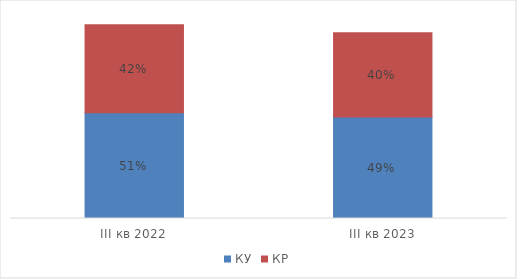
| Category | КУ | КР |
|---|---|---|
| III кв 2022 | 0.509 | 0.422 |
| III кв 2023 | 0.488 | 0.404 |